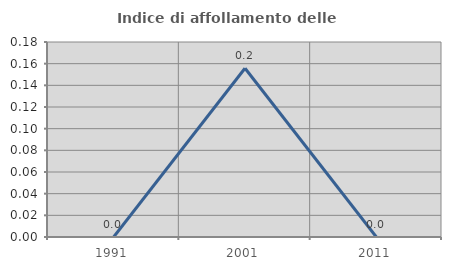
| Category | Indice di affollamento delle abitazioni  |
|---|---|
| 1991.0 | 0 |
| 2001.0 | 0.156 |
| 2011.0 | 0 |